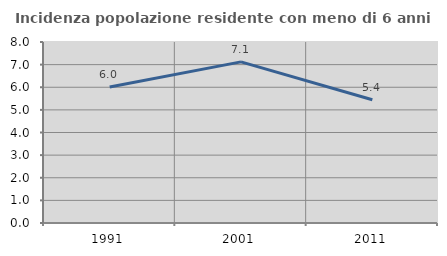
| Category | Incidenza popolazione residente con meno di 6 anni |
|---|---|
| 1991.0 | 6.012 |
| 2001.0 | 7.121 |
| 2011.0 | 5.445 |